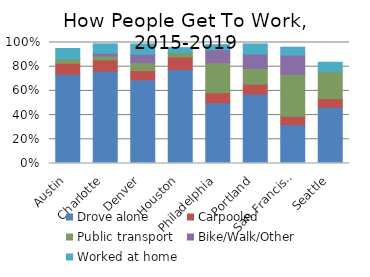
| Category | Drove alone | Carpooled | Public transport | Bike/Walk/Other | Worked at home |
|---|---|---|---|---|---|
| Austin | 0.737 | 0.091 | 0.035 | 0 | 0.087 |
| Charlotte | 0.763 | 0.093 | 0.033 | 0.022 | 0.077 |
| Denver | 0.691 | 0.077 | 0.065 | 0.069 | 0.085 |
| Houston | 0.777 | 0.104 | 0.037 | 0 | 0.04 |
| Philadelphia | 0.503 | 0.082 | 0.249 | 0.107 | 0.042 |
| Portland | 0.573 | 0.083 | 0.129 | 0.118 | 0.085 |
| San Francisco | 0.321 | 0.069 | 0.348 | 0.157 | 0.066 |
| Seattle | 0.465 | 0.072 | 0.226 | 0 | 0.074 |